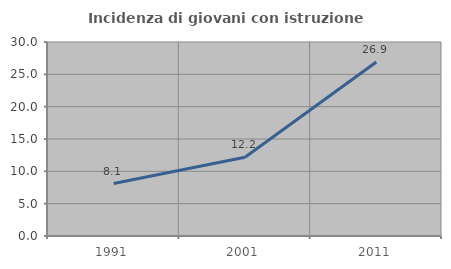
| Category | Incidenza di giovani con istruzione universitaria |
|---|---|
| 1991.0 | 8.112 |
| 2001.0 | 12.187 |
| 2011.0 | 26.91 |